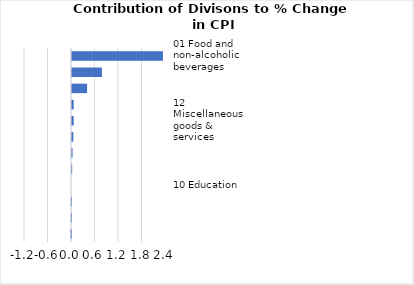
| Category |     Contributions |
|---|---|
| 01 Food and non-alcoholic beverages | 2.321 |
| 08 Communication | 0.764 |
| 07 Transport | 0.385 |
| 02 Alcoholic beverages, tobacco & narcotics | 0.044 |
| 12 Miscellaneous goods & services | 0.044 |
| 06 Health | 0.034 |
| 05 Furnishings, household equipment & maintenance | 0.014 |
| 11 Restaurants and hotels | 0.004 |
| 10 Education | 0 |
| 04 Housing, water, electricity, gas & other fuels | -0.006 |
| 09 Recreation and culture | -0.006 |
| 03 Clothing and footwear | -0.017 |